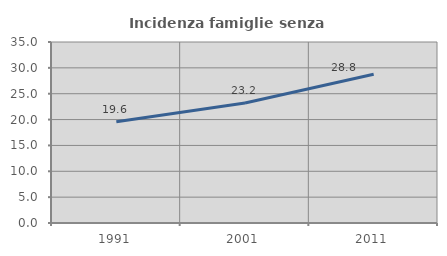
| Category | Incidenza famiglie senza nuclei |
|---|---|
| 1991.0 | 19.567 |
| 2001.0 | 23.199 |
| 2011.0 | 28.775 |